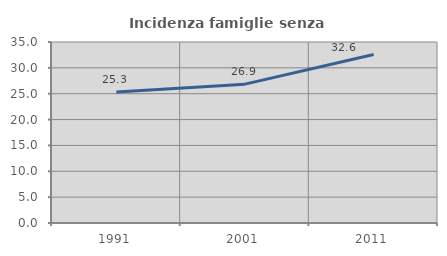
| Category | Incidenza famiglie senza nuclei |
|---|---|
| 1991.0 | 25.314 |
| 2001.0 | 26.852 |
| 2011.0 | 32.592 |